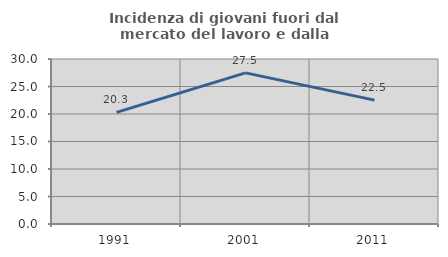
| Category | Incidenza di giovani fuori dal mercato del lavoro e dalla formazione  |
|---|---|
| 1991.0 | 20.305 |
| 2001.0 | 27.483 |
| 2011.0 | 22.524 |